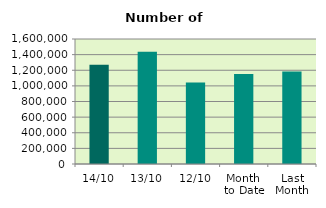
| Category | Series 0 |
|---|---|
| 14/10 | 1271772 |
| 13/10 | 1437912 |
| 12/10 | 1043224 |
| Month 
to Date | 1152388.8 |
| Last
Month | 1182612.273 |